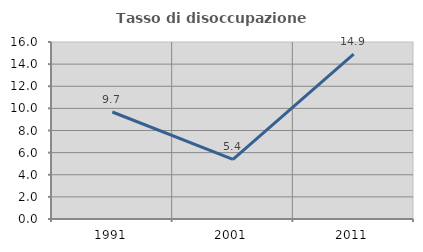
| Category | Tasso di disoccupazione giovanile  |
|---|---|
| 1991.0 | 9.672 |
| 2001.0 | 5.381 |
| 2011.0 | 14.902 |